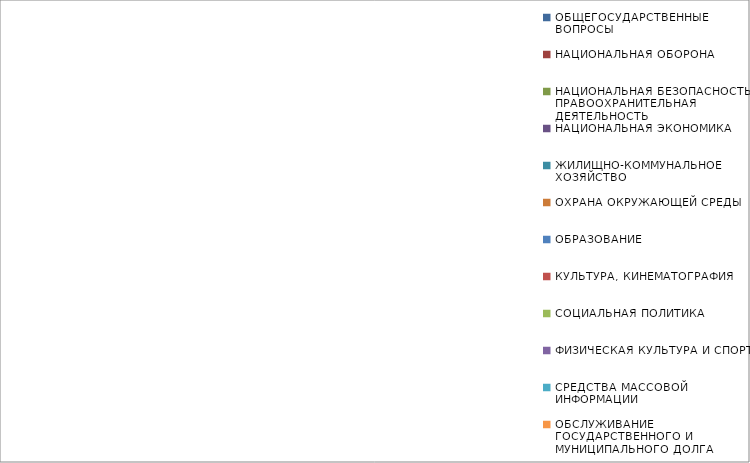
| Category | Series 0 |
|---|---|
| ОБЩЕГОСУДАРСТВЕННЫЕ ВОПРОСЫ | 0 |
| НАЦИОНАЛЬНАЯ ОБОРОНА | 0 |
| НАЦИОНАЛЬНАЯ БЕЗОПАСНОСТЬ И ПРАВООХРАНИТЕЛЬНАЯ ДЕЯТЕЛЬНОСТЬ | 0 |
| НАЦИОНАЛЬНАЯ ЭКОНОМИКА | 0 |
| ЖИЛИЩНО-КОММУНАЛЬНОЕ ХОЗЯЙСТВО | 0 |
| ОХРАНА ОКРУЖАЮЩЕЙ СРЕДЫ | 0 |
| ОБРАЗОВАНИЕ | 0 |
| КУЛЬТУРА, КИНЕМАТОГРАФИЯ | 0 |
| СОЦИАЛЬНАЯ ПОЛИТИКА | 0 |
| ФИЗИЧЕСКАЯ КУЛЬТУРА И СПОРТ | 0 |
| СРЕДСТВА МАССОВОЙ ИНФОРМАЦИИ | 0 |
| ОБСЛУЖИВАНИЕ ГОСУДАРСТВЕННОГО И МУНИЦИПАЛЬНОГО ДОЛГА | 0 |